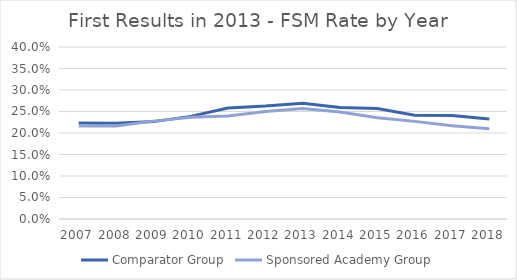
| Category | Comparator Group | Sponsored Academy Group |
|---|---|---|
| 2007.0 | 0.223 | 0.216 |
| 2008.0 | 0.223 | 0.217 |
| 2009.0 | 0.226 | 0.228 |
| 2010.0 | 0.239 | 0.237 |
| 2011.0 | 0.258 | 0.24 |
| 2012.0 | 0.263 | 0.25 |
| 2013.0 | 0.269 | 0.257 |
| 2014.0 | 0.259 | 0.249 |
| 2015.0 | 0.257 | 0.235 |
| 2016.0 | 0.241 | 0.227 |
| 2017.0 | 0.241 | 0.217 |
| 2018.0 | 0.233 | 0.21 |